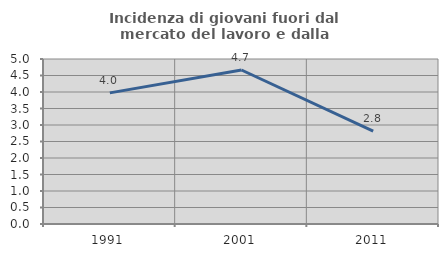
| Category | Incidenza di giovani fuori dal mercato del lavoro e dalla formazione  |
|---|---|
| 1991.0 | 3.974 |
| 2001.0 | 4.667 |
| 2011.0 | 2.817 |